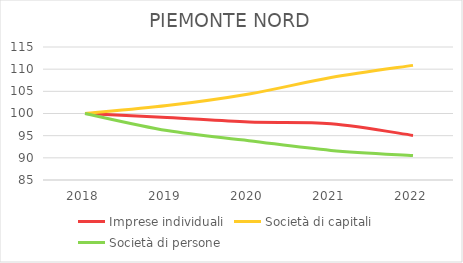
| Category | Imprese individuali | Società di capitali | Società di persone |
|---|---|---|---|
| 2018.0 | 100 | 100 | 100 |
| 2019.0 | 99.111 | 101.78 | 96.152 |
| 2020.0 | 98.066 | 104.407 | 93.873 |
| 2021.0 | 97.694 | 108.113 | 91.669 |
| 2022.0 | 95.062 | 110.859 | 90.505 |